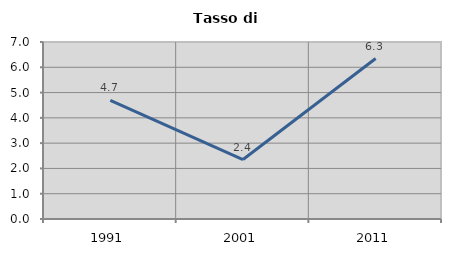
| Category | Tasso di disoccupazione   |
|---|---|
| 1991.0 | 4.692 |
| 2001.0 | 2.35 |
| 2011.0 | 6.345 |